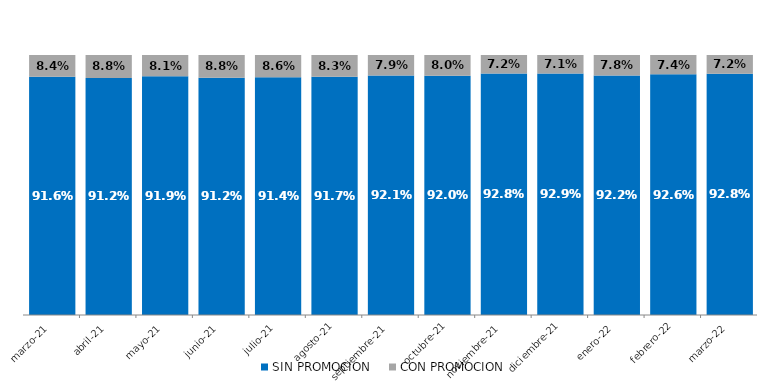
| Category | SIN PROMOCION   | CON PROMOCION   |
|---|---|---|
| 2021-03-01 | 0.916 | 0.084 |
| 2021-04-01 | 0.912 | 0.088 |
| 2021-05-01 | 0.919 | 0.081 |
| 2021-06-01 | 0.912 | 0.088 |
| 2021-07-01 | 0.914 | 0.086 |
| 2021-08-01 | 0.917 | 0.083 |
| 2021-09-01 | 0.921 | 0.079 |
| 2021-10-01 | 0.92 | 0.08 |
| 2021-11-01 | 0.928 | 0.072 |
| 2021-12-01 | 0.929 | 0.071 |
| 2022-01-01 | 0.922 | 0.078 |
| 2022-02-01 | 0.926 | 0.074 |
| 2022-03-01 | 0.928 | 0.072 |